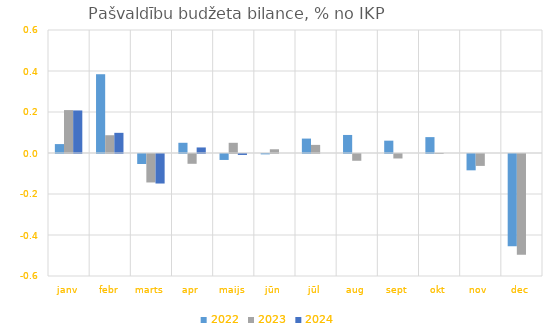
| Category | 2022 | 2023 | 2024 |
|---|---|---|---|
| janv | 0.044 | 0.209 | 0.208 |
| febr | 0.384 | 0.087 | 0.098 |
| marts | -0.049 | -0.139 | -0.144 |
| apr | 0.05 | -0.048 | 0.027 |
| maijs | -0.029 | 0.05 | -0.005 |
| jūn | -0.002 | 0.018 | 0 |
| jūl | 0.07 | 0.04 | 0 |
| aug | 0.088 | -0.033 | 0 |
| sept | 0.06 | -0.022 | 0 |
| okt | 0.077 | 0 | 0 |
| nov | -0.08 | -0.058 | 0 |
| dec | -0.451 | -0.491 | 0 |